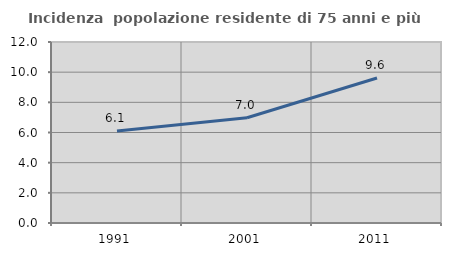
| Category | Incidenza  popolazione residente di 75 anni e più |
|---|---|
| 1991.0 | 6.095 |
| 2001.0 | 6.982 |
| 2011.0 | 9.615 |